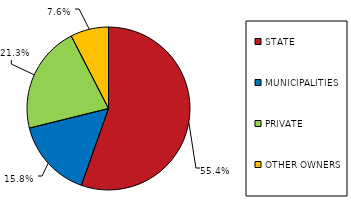
| Category | 2015 |
|---|---|
| STATE | 1478528 |
| MUNICIPALITIES | 419421 |
| PRIVATE | 568736 |
| OTHER OWNERS | 201707 |